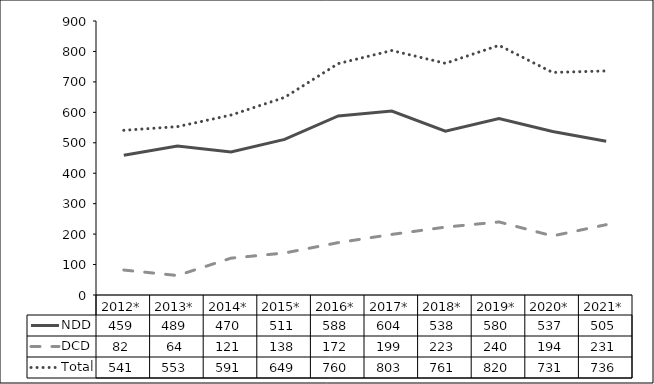
| Category | NDD | DCD | Total |
|---|---|---|---|
| 2012* | 459 | 82 | 541 |
| 2013* | 489 | 64 | 553 |
| 2014* | 470 | 121 | 591 |
| 2015* | 511 | 138 | 649 |
| 2016* | 588 | 172 | 760 |
| 2017* | 604 | 199 | 803 |
| 2018* | 538 | 223 | 761 |
| 2019* | 580 | 240 | 820 |
| 2020* | 537 | 194 | 731 |
| 2021* | 505 | 231 | 736 |